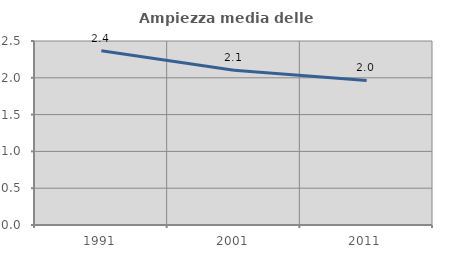
| Category | Ampiezza media delle famiglie |
|---|---|
| 1991.0 | 2.367 |
| 2001.0 | 2.104 |
| 2011.0 | 1.965 |